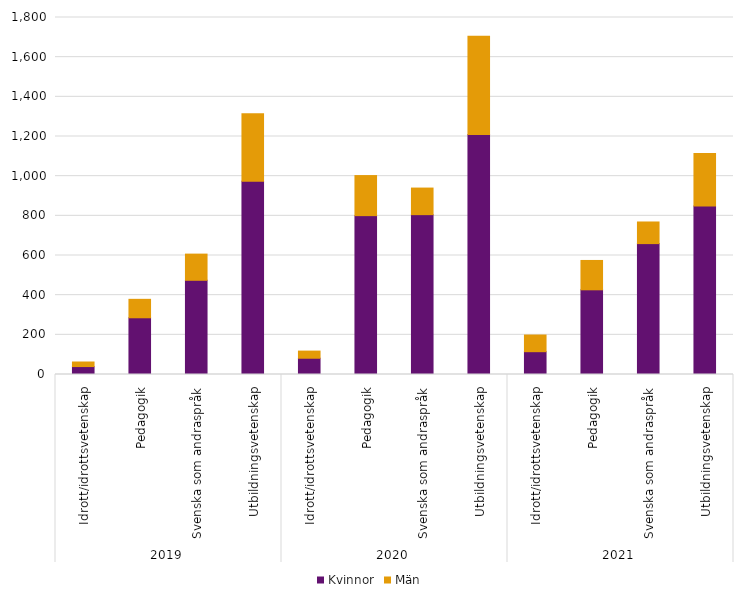
| Category | Kvinnor | Män |
|---|---|---|
| 0 | 40 | 23 |
| 1 | 286 | 93 |
| 2 | 475 | 132 |
| 3 | 975 | 340 |
| 4 | 82 | 36 |
| 5 | 801 | 202 |
| 6 | 806 | 134 |
| 7 | 1210 | 495 |
| 8 | 115 | 84 |
| 9 | 427 | 148 |
| 10 | 660 | 109 |
| 11 | 850 | 264 |